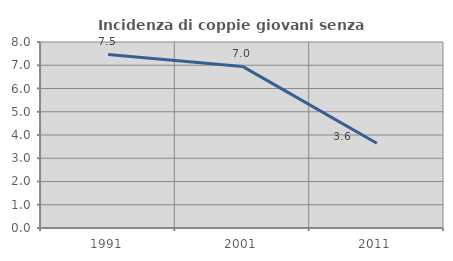
| Category | Incidenza di coppie giovani senza figli |
|---|---|
| 1991.0 | 7.463 |
| 2001.0 | 6.95 |
| 2011.0 | 3.646 |